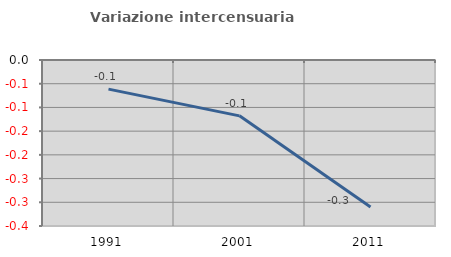
| Category | Variazione intercensuaria annua |
|---|---|
| 1991.0 | -0.061 |
| 2001.0 | -0.118 |
| 2011.0 | -0.31 |